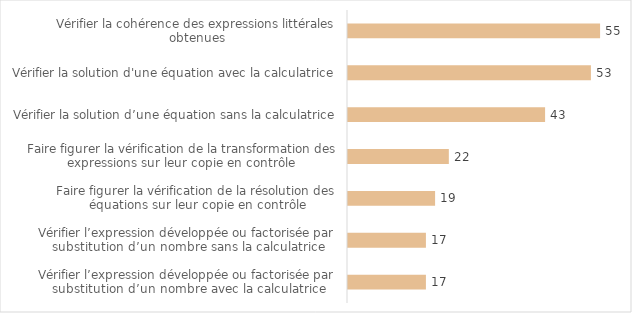
| Category | Souvent ou 
Très souvent |
|---|---|
| Vérifier la cohérence des expressions littérales obtenues | 55 |
| Vérifier la solution d'une équation avec la calculatrice | 53 |
| Vérifier la solution d’une équation sans la calculatrice | 43 |
| Faire figurer la vérification de la transformation des expressions sur leur copie en contrôle | 22 |
| Faire figurer la vérification de la résolution des équations sur leur copie en contrôle | 19 |
| Vérifier l’expression développée ou factorisée par substitution d’un nombre sans la calculatrice | 17 |
| Vérifier l’expression développée ou factorisée par substitution d’un nombre avec la calculatrice | 17 |